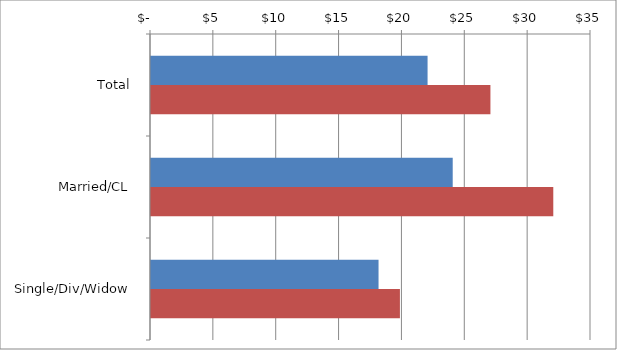
| Category | Series 0 | Series 1 |
|---|---|---|
| Total | 22 | 27 |
|  Married/CL  | 24 | 32 |
|  Single/Div/Widow  | 18.1 | 19.8 |